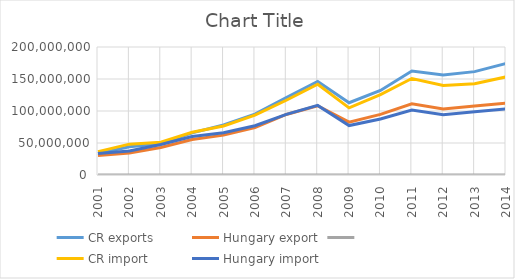
| Category | CR exports | Hungary export | Series 2 | CR import | Hungary import |
|---|---|---|---|---|---|
| 2001.0 | 33384210 | 30497719 | 2001 | 36476654 | 33681734 |
| 2002.0 | 44263576 | 34336583 | 2002 | 48230794 | 37611572 |
| 2003.0 | 48720350 | 43003656 | 2003 | 51239343 | 47674542 |
| 2004.0 | 65771587 | 55468212 | 2004 | 66705682 | 60248602 |
| 2005.0 | 78208548 | 62271839 | 2005 | 76527310 | 65919579 |
| 2006.0 | 95140986 | 74055406 | 2006 | 93429474 | 76978511 |
| 2007.0 | 120900492 | 94590870 | 2007 | 116822197 | 94659727 |
| 2008.0 | 146087029 | 108211166 | 2008 | 141833836 | 108784724 |
| 2009.0 | 112884321 | 82571847 | 2009 | 104849536 | 77272443 |
| 2010.0 | 132140914 | 94748737 | 2010 | 125690658 | 87432095 |
| 2011.0 | 162391721 | 111216834 | 2011 | 150813416 | 101369997 |
| 2012.0 | 156422743 | 103006014 | 2012 | 139726824 | 94266239 |
| 2013.0 | 161524152 | 107729976 | 2013 | 142525808 | 98661803 |
| 2014.0 | 174279452 | 112196295 | 2014 | 153225461 | 103110997 |